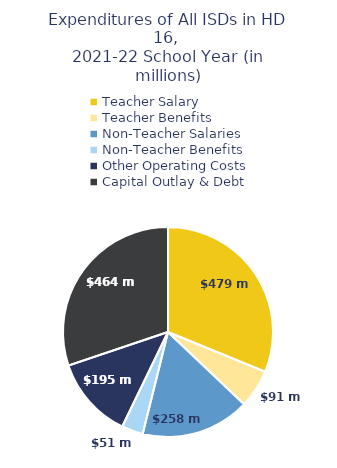
| Category | Series 0 |
|---|---|
| Teacher Salary | 479385458 |
| Teacher Benefits | 90865849 |
| Non-Teacher Salaries | 258227702 |
| Non-Teacher Benefits | 50721517 |
| Other Operating Costs | 194627098 |
| Capital Outlay & Debt | 463922360 |